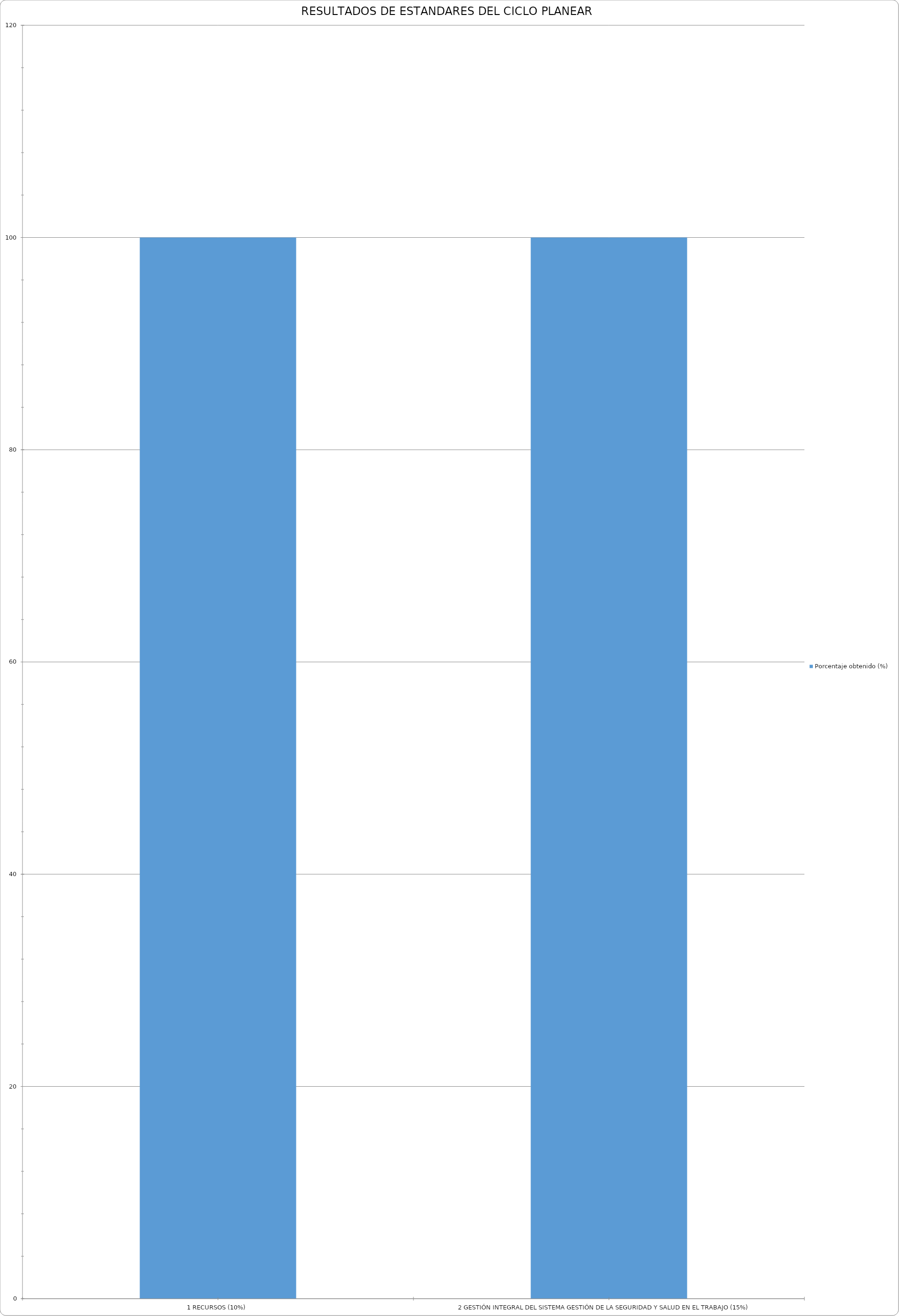
| Category | Porcentaje obtenido (%) |
|---|---|
| 1 RECURSOS (10%) | 100 |
| 2 GESTIÓN INTEGRAL DEL SISTEMA GESTIÓN DE LA SEGURIDAD Y SALUD EN EL TRABAJO (15%) | 100 |